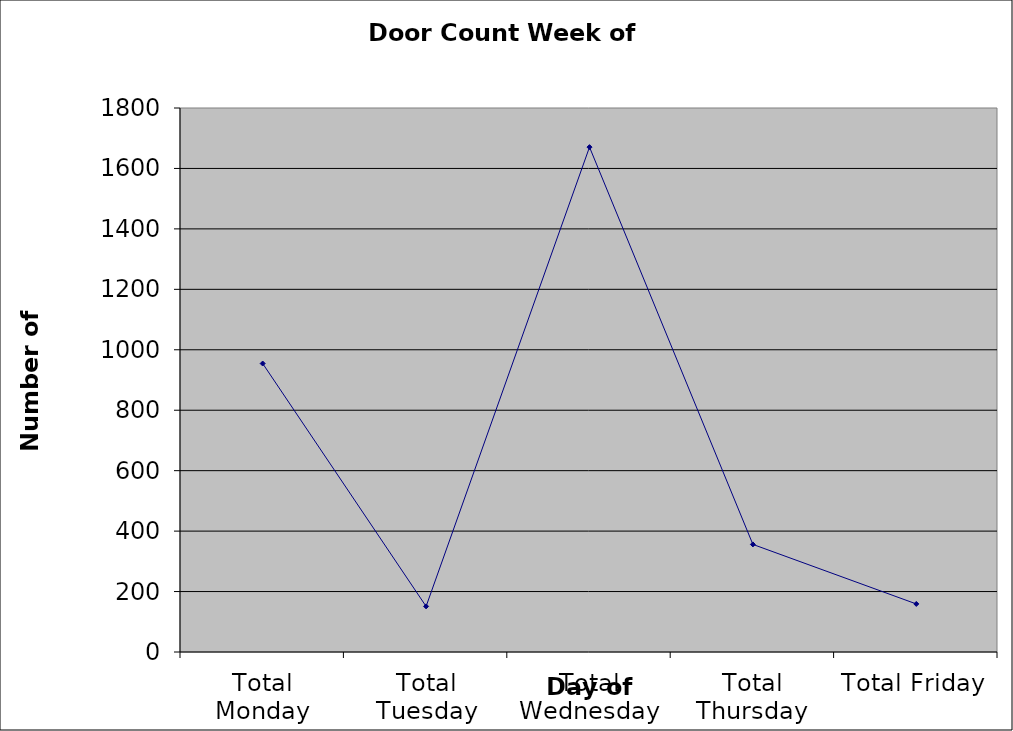
| Category | Series 0 |
|---|---|
| Total Monday | 954.5 |
| Total Tuesday | 151 |
| Total Wednesday | 1670.5 |
| Total Thursday | 356 |
| Total Friday | 159 |